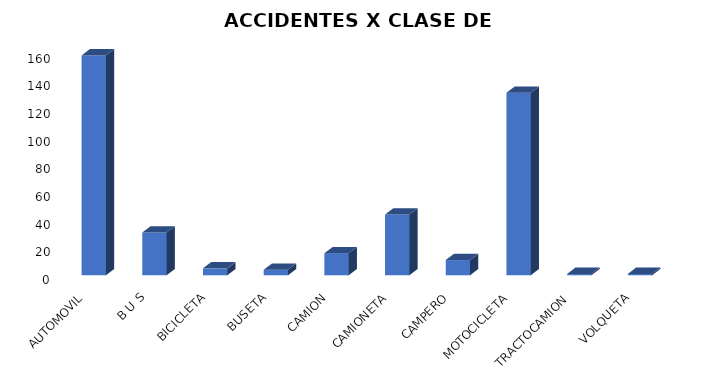
| Category | Total |
|---|---|
| AUTOMOVIL | 159 |
| B U S | 31 |
| BICICLETA | 5 |
| BUSETA | 4 |
| CAMION | 16 |
| CAMIONETA | 44 |
| CAMPERO | 11 |
| MOTOCICLETA | 132 |
| TRACTOCAMION | 1 |
| VOLQUETA | 1 |